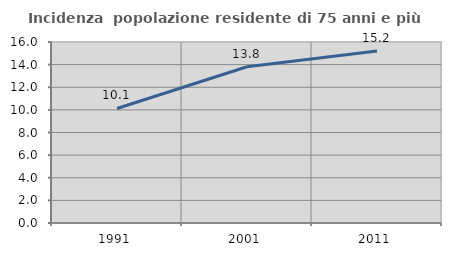
| Category | Incidenza  popolazione residente di 75 anni e più |
|---|---|
| 1991.0 | 10.122 |
| 2001.0 | 13.817 |
| 2011.0 | 15.202 |